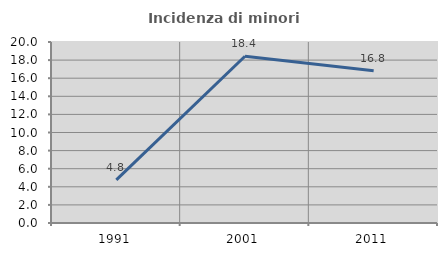
| Category | Incidenza di minori stranieri |
|---|---|
| 1991.0 | 4.762 |
| 2001.0 | 18.421 |
| 2011.0 | 16.814 |